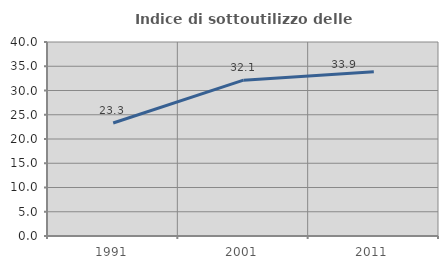
| Category | Indice di sottoutilizzo delle abitazioni  |
|---|---|
| 1991.0 | 23.298 |
| 2001.0 | 32.129 |
| 2011.0 | 33.85 |